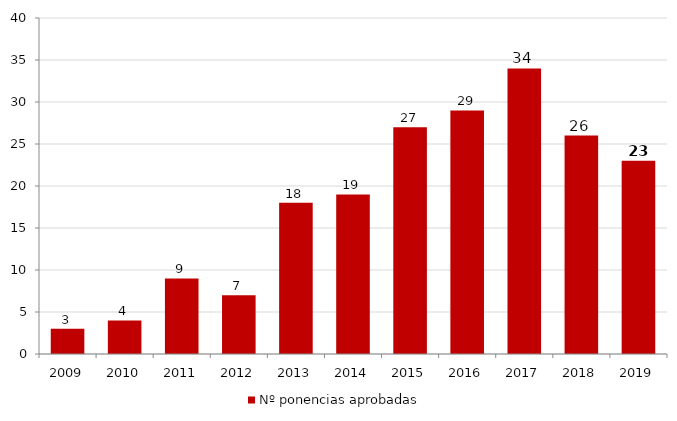
| Category | Nº ponencias aprobadas |
|---|---|
| 2009.0 | 3 |
| 2010.0 | 4 |
| 2011.0 | 9 |
| 2012.0 | 7 |
| 2013.0 | 18 |
| 2014.0 | 19 |
| 2015.0 | 27 |
| 2016.0 | 29 |
| 2017.0 | 34 |
| 2018.0 | 26 |
| 2019.0 | 23 |